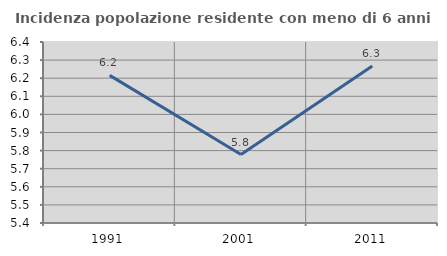
| Category | Incidenza popolazione residente con meno di 6 anni |
|---|---|
| 1991.0 | 6.216 |
| 2001.0 | 5.778 |
| 2011.0 | 6.268 |